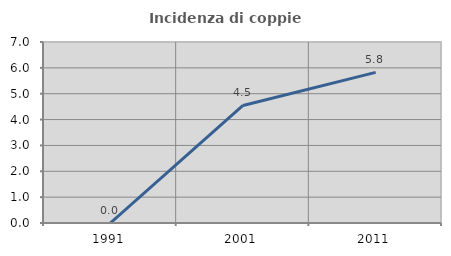
| Category | Incidenza di coppie miste |
|---|---|
| 1991.0 | 0 |
| 2001.0 | 4.545 |
| 2011.0 | 5.825 |